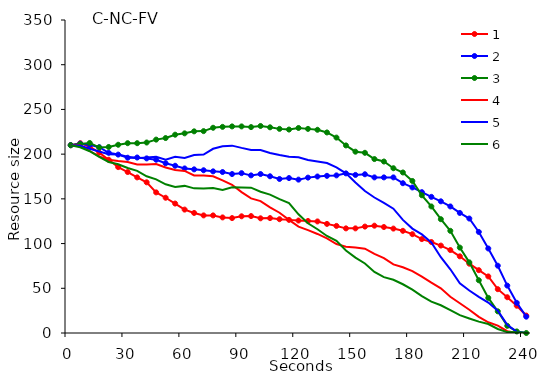
| Category | 1 | 2 | 3 | 4 | 5 | 6 |
|---|---|---|---|---|---|---|
| 0.0 | 210 | 210 | 210 | 210 | 210 | 210 |
| 5.0 | 212.25 | 211.75 | 211.25 | 209.75 | 209.5 | 207.75 |
| 10.0 | 208.25 | 210.5 | 212.5 | 203.5 | 206 | 203.25 |
| 15.0 | 201.75 | 207.75 | 207.5 | 197.5 | 203 | 197 |
| 20.0 | 193.75 | 201.5 | 208 | 193.75 | 200 | 191.25 |
| 25.0 | 185.5 | 199.5 | 210.5 | 192.25 | 199.5 | 188.75 |
| 30.0 | 180 | 196 | 212.25 | 191.25 | 197 | 184.5 |
| 35.0 | 174 | 196.25 | 212.25 | 188.5 | 195.5 | 181.25 |
| 40.0 | 168.5 | 195.25 | 213 | 188.5 | 196.25 | 175.25 |
| 45.0 | 157.25 | 193.75 | 216.25 | 189 | 197 | 171.75 |
| 50.0 | 151.25 | 189.75 | 218 | 185 | 193.75 | 166.25 |
| 55.0 | 144.75 | 187 | 221.75 | 182.25 | 197 | 163.25 |
| 60.0 | 138 | 184 | 223.25 | 181.25 | 195.75 | 164.5 |
| 65.0 | 134.25 | 183 | 225.5 | 176.25 | 199 | 161.75 |
| 70.0 | 131.5 | 182 | 225.75 | 176.25 | 199.5 | 161.5 |
| 75.0 | 131.5 | 180.75 | 229.5 | 175.25 | 206 | 162 |
| 80.0 | 129.25 | 180 | 230.5 | 170.75 | 208.75 | 160 |
| 85.0 | 128.5 | 177.75 | 231 | 165.75 | 209.5 | 163 |
| 90.0 | 130.5 | 178.75 | 231 | 157.5 | 207 | 162.75 |
| 95.0 | 130.75 | 176.25 | 230.25 | 150.5 | 204.75 | 162.5 |
| 100.0 | 128.25 | 177.75 | 231.5 | 147.5 | 204.5 | 158 |
| 105.0 | 128.5 | 175.25 | 230 | 140.5 | 201.25 | 154.75 |
| 110.0 | 127.25 | 172.25 | 228.25 | 134.5 | 199 | 149.75 |
| 115.0 | 126.5 | 173.25 | 227.5 | 126.5 | 197 | 145.25 |
| 120.0 | 125.75 | 171.5 | 229.25 | 119 | 196.5 | 132.75 |
| 125.0 | 125.25 | 173.75 | 228.25 | 115 | 193.5 | 122.75 |
| 130.0 | 124.75 | 175 | 227.25 | 110.75 | 191.75 | 116 |
| 135.0 | 122 | 175.75 | 224.25 | 105.75 | 190 | 108.5 |
| 140.0 | 119.75 | 176.25 | 218.5 | 99.5 | 185.25 | 103 |
| 145.0 | 117 | 178.5 | 209.75 | 96.5 | 178.5 | 92.25 |
| 150.0 | 117 | 176.75 | 202.75 | 95.5 | 168.25 | 84.25 |
| 155.0 | 119 | 177.5 | 201.5 | 94.25 | 158.75 | 77.75 |
| 160.0 | 120 | 174 | 194.5 | 88.5 | 151.5 | 68.25 |
| 165.0 | 118.5 | 174 | 191.75 | 83.75 | 145.5 | 62.5 |
| 170.0 | 116.75 | 174 | 184.25 | 76.75 | 139 | 59.5 |
| 175.0 | 114.25 | 167.5 | 179.5 | 73.5 | 126.5 | 54.5 |
| 180.0 | 110.5 | 162.75 | 170 | 69.25 | 116.75 | 48.5 |
| 185.0 | 105 | 157.5 | 154 | 63 | 110.25 | 41.25 |
| 190.0 | 101.75 | 152.25 | 141.5 | 56.25 | 101.25 | 35 |
| 195.0 | 97.75 | 147.25 | 127.25 | 50 | 84.75 | 31 |
| 200.0 | 92.75 | 141.5 | 114.25 | 40.5 | 71.25 | 25.5 |
| 205.0 | 85.75 | 134.25 | 95.5 | 33.25 | 55.5 | 20 |
| 210.0 | 77.5 | 128 | 79 | 26 | 47.5 | 16.25 |
| 215.0 | 70.25 | 113 | 59 | 18 | 40.5 | 12.75 |
| 220.0 | 63.25 | 94.5 | 39.25 | 12 | 34 | 10 |
| 225.0 | 49 | 75.25 | 24.25 | 8.25 | 25 | 4.5 |
| 230.0 | 40 | 53 | 8 | 2 | 9.25 | 1 |
| 235.0 | 30.5 | 33.75 | 1.75 | 0 | 1.25 | 0.75 |
| 240.0 | 19.5 | 18.25 | 0 | 0 | 0 | 0 |